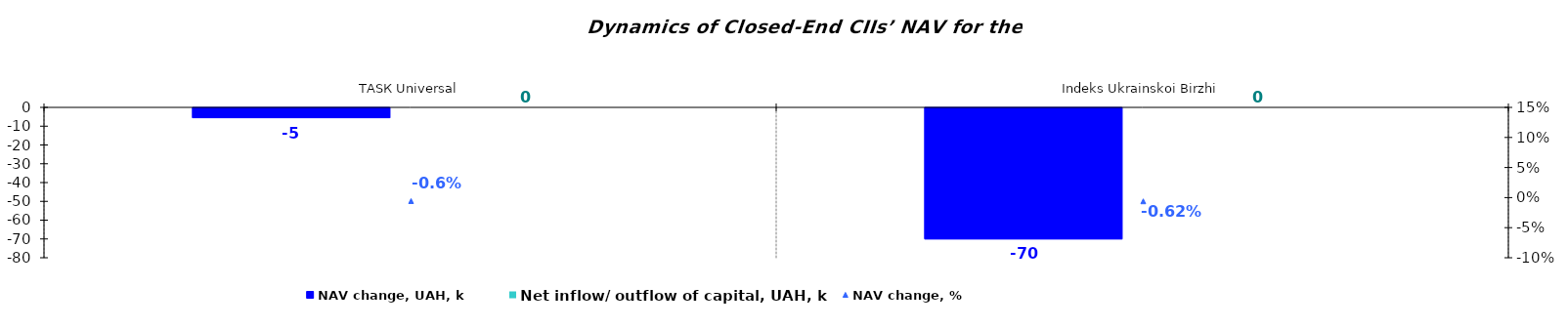
| Category | NAV change, UAH, k | Net inflow/ outflow of capital, UAH, k |
|---|---|---|
| ТАSК Universal | -5.247 | 0 |
| Іndeks Ukrainskoi Birzhi | -69.699 | 0 |